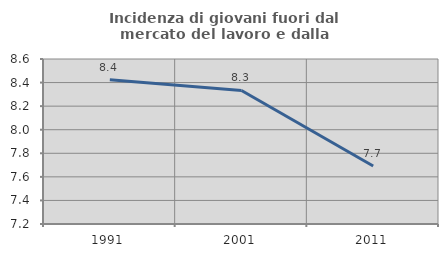
| Category | Incidenza di giovani fuori dal mercato del lavoro e dalla formazione  |
|---|---|
| 1991.0 | 8.424 |
| 2001.0 | 8.333 |
| 2011.0 | 7.692 |